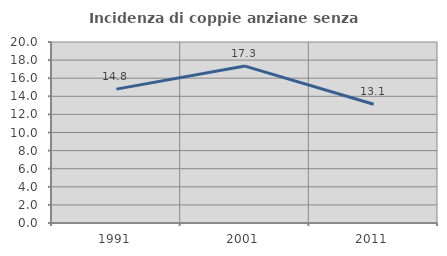
| Category | Incidenza di coppie anziane senza figli  |
|---|---|
| 1991.0 | 14.793 |
| 2001.0 | 17.341 |
| 2011.0 | 13.115 |